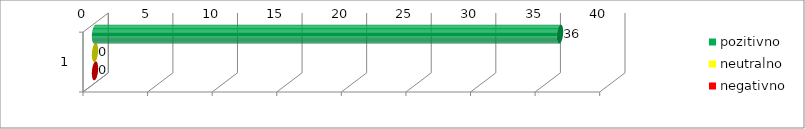
| Category | pozitivno | neutralno | negativno |
|---|---|---|---|
| 0 | 36 | 0 | 0 |